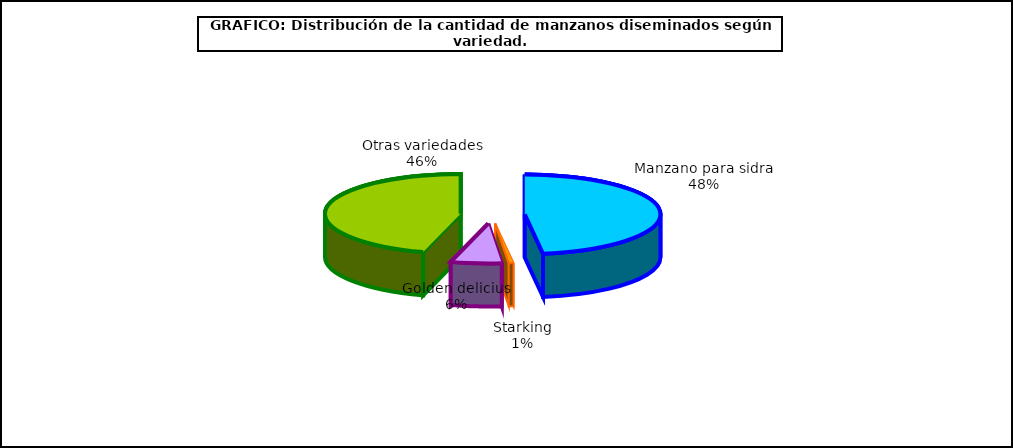
| Category | arboles |
|---|---|
| 0 | 701.995 |
| 1 | 8.134 |
| 2 | 88.789 |
| 3 | 668.151 |